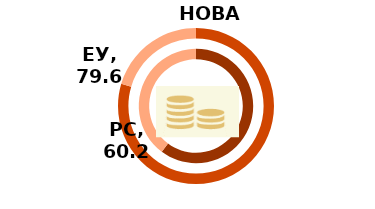
| Category | РС | Series 1 | ЕУ |
|---|---|---|---|
| Index | 60.2 |  | 79.6 |
| Rest | 39.8 |  | 20.4 |